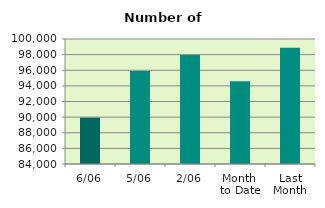
| Category | Series 0 |
|---|---|
| 6/06 | 89928 |
| 5/06 | 95914 |
| 2/06 | 97938 |
| Month 
to Date | 94588.5 |
| Last
Month | 98885.545 |